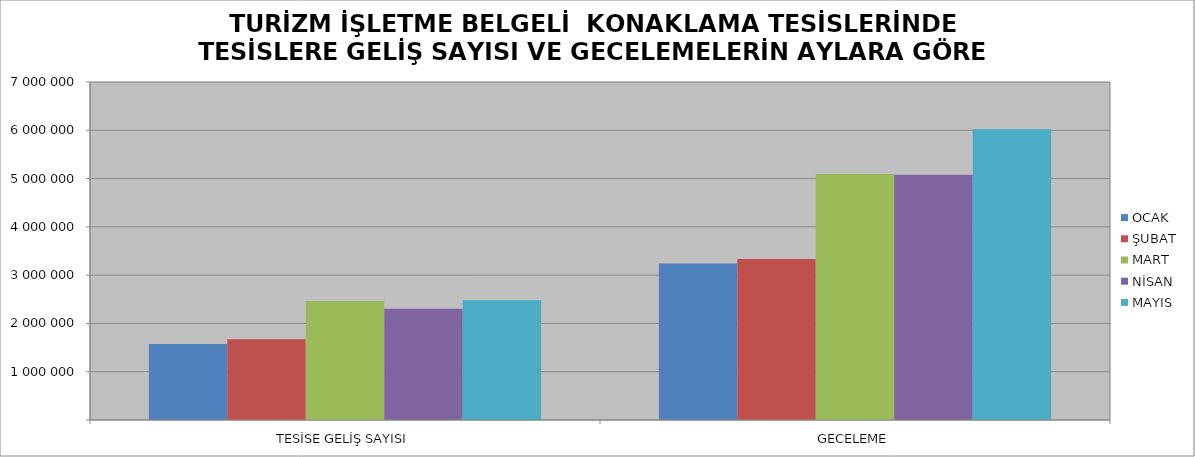
| Category | OCAK | ŞUBAT | MART | NİSAN | MAYIS |
|---|---|---|---|---|---|
| TESİSE GELİŞ SAYISI | 1571594 | 1670164 | 2462715 | 2305703 | 2480312 |
| GECELEME | 3239980 | 3333484 | 5094921 | 5081446 | 6019981 |